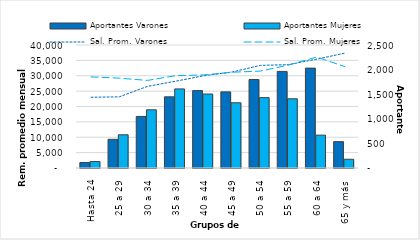
| Category | Aportantes Varones | Aportantes Mujeres |
|---|---|---|
| 0 | 112 | 131 |
| 1 | 583 | 675 |
| 2 | 1048 | 1183 |
| 3 | 1447 | 1607 |
| 4 | 1574 | 1504 |
| 5 | 1547 | 1326 |
| 6 | 1799 | 1430 |
| 7 | 1963 | 1407 |
| 8 | 2030 | 668 |
| 9 | 536 | 178 |